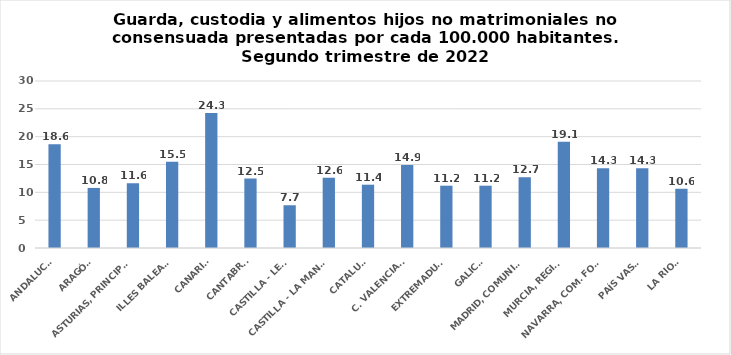
| Category | Series 0 |
|---|---|
| ANDALUCÍA | 18.633 |
| ARAGÓN | 10.79 |
| ASTURIAS, PRINCIPADO | 11.648 |
| ILLES BALEARS | 15.473 |
| CANARIAS | 24.26 |
| CANTABRIA | 12.474 |
| CASTILLA - LEÓN | 7.679 |
| CASTILLA - LA MANCHA | 12.621 |
| CATALUÑA | 11.37 |
| C. VALENCIANA | 14.889 |
| EXTREMADURA | 11.193 |
| GALICIA | 11.193 |
| MADRID, COMUNIDAD | 12.692 |
| MURCIA, REGIÓN | 19.067 |
| NAVARRA, COM. FORAL | 14.316 |
| PAÍS VASCO | 14.317 |
| LA RIOJA | 10.642 |